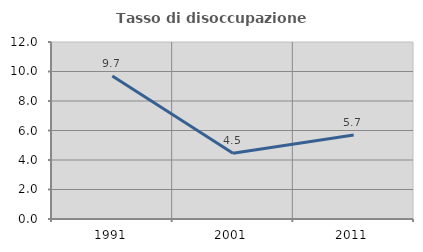
| Category | Tasso di disoccupazione giovanile  |
|---|---|
| 1991.0 | 9.69 |
| 2001.0 | 4.455 |
| 2011.0 | 5.696 |